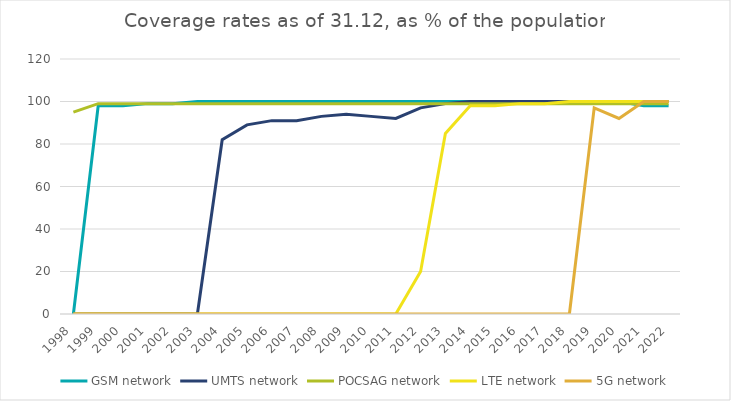
| Category | GSM network | UMTS network | POCSAG network | LTE network | 5G network |
|---|---|---|---|---|---|
| 1998.0 | 0 | 0 | 95 | 0 | 0 |
| 1999.0 | 98 | 0 | 99 | 0 | 0 |
| 2000.0 | 98 | 0 | 99 | 0 | 0 |
| 2001.0 | 99 | 0 | 99 | 0 | 0 |
| 2002.0 | 99 | 0 | 99 | 0 | 0 |
| 2003.0 | 100 | 0 | 99 | 0 | 0 |
| 2004.0 | 100 | 82 | 99 | 0 | 0 |
| 2005.0 | 100 | 89 | 99 | 0 | 0 |
| 2006.0 | 100 | 91 | 99 | 0 | 0 |
| 2007.0 | 100 | 91 | 99 | 0 | 0 |
| 2008.0 | 100 | 93 | 99 | 0 | 0 |
| 2009.0 | 100 | 94 | 99 | 0 | 0 |
| 2010.0 | 100 | 93 | 99 | 0 | 0 |
| 2011.0 | 100 | 92 | 99 | 0 | 0 |
| 2012.0 | 100 | 97 | 99 | 20 | 0 |
| 2013.0 | 100 | 99 | 99 | 85 | 0 |
| 2014.0 | 100 | 100 | 99 | 98 | 0 |
| 2015.0 | 100 | 100 | 99 | 98 | 0 |
| 2016.0 | 100 | 100 | 99 | 99 | 0 |
| 2017.0 | 100 | 100 | 99 | 99 | 0 |
| 2018.0 | 100 | 100 | 99 | 100 | 0 |
| 2019.0 | 100 | 100 | 99 | 100 | 97 |
| 2020.0 | 100 | 100 | 99 | 100 | 92 |
| 2021.0 | 98 | 100 | 99 | 100 | 100 |
| 2022.0 | 98 | 100 | 99 | 100 | 100 |